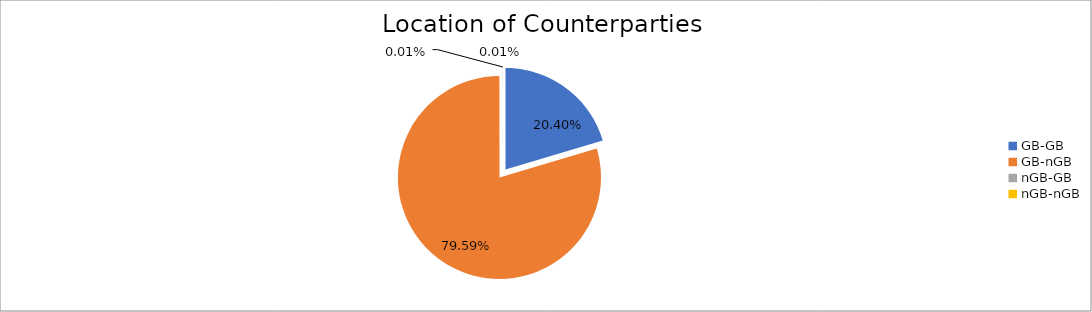
| Category | Series 0 |
|---|---|
| GB-GB | 1989212.311 |
| GB-nGB | 7761921.363 |
| nGB-GB | 524.546 |
| nGB-nGB | 1173.057 |